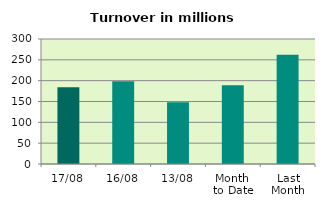
| Category | Series 0 |
|---|---|
| 17/08 | 184.249 |
| 16/08 | 198.59 |
| 13/08 | 147.93 |
| Month 
to Date | 189.272 |
| Last
Month | 262.308 |